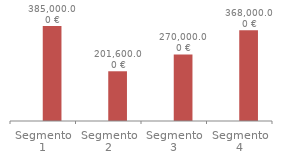
| Category | % variación | valor |
|---|---|---|
| Segmento 1 | 0.1 | 385000 |
| Segmento 2 | 0.12 | 201600 |
| Segmento 3 | 0.08 | 270000 |
| Segmento 4 | 0.15 | 368000 |